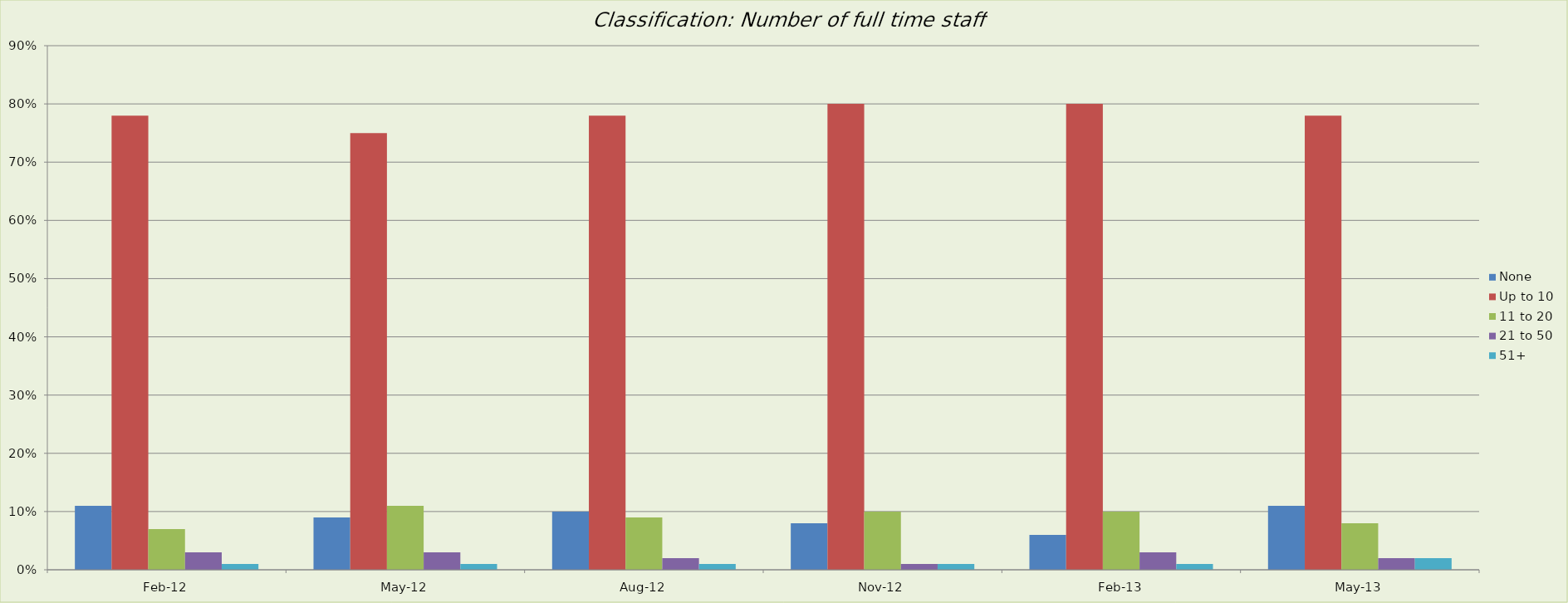
| Category | None | Up to 10 | 11 to 20 | 21 to 50 | 51+ |
|---|---|---|---|---|---|
| 2012-02-01 | 0.11 | 0.78 | 0.07 | 0.03 | 0.01 |
| 2012-05-01 | 0.09 | 0.75 | 0.11 | 0.03 | 0.01 |
| 2012-08-01 | 0.1 | 0.78 | 0.09 | 0.02 | 0.01 |
| 2012-11-01 | 0.08 | 0.8 | 0.1 | 0.01 | 0.01 |
| 2013-02-01 | 0.06 | 0.8 | 0.1 | 0.03 | 0.01 |
| 2013-05-01 | 0.11 | 0.78 | 0.08 | 0.02 | 0.02 |